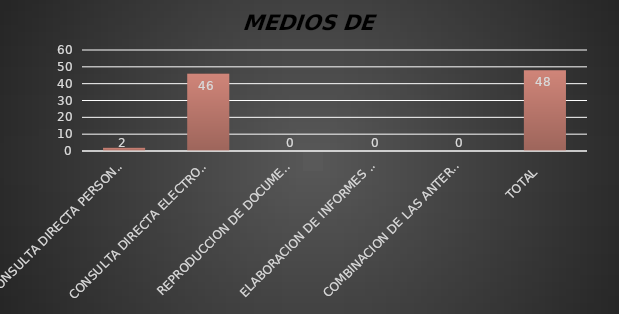
| Category | Series 1 |
|---|---|
| CONSULTA DIRECTA PERSONAL | 2 |
| CONSULTA DIRECTA ELECTRONICA | 46 |
| REPRODUCCION DE DOCUMENTOS  | 0 |
| ELABORACION DE INFORMES ESPECIFICOS  | 0 |
| COMBINACION DE LAS ANTERIORES | 0 |
| TOTAL  | 48 |